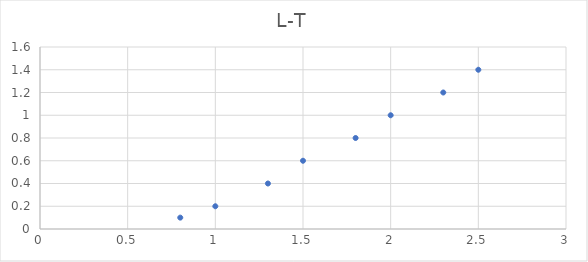
| Category | Series 0 |
|---|---|
| 0.8 | 0.1 |
| 1.0 | 0.2 |
| 1.3 | 0.4 |
| 1.5 | 0.6 |
| 1.8 | 0.8 |
| 2.0 | 1 |
| 2.3 | 1.2 |
| 2.5 | 1.4 |